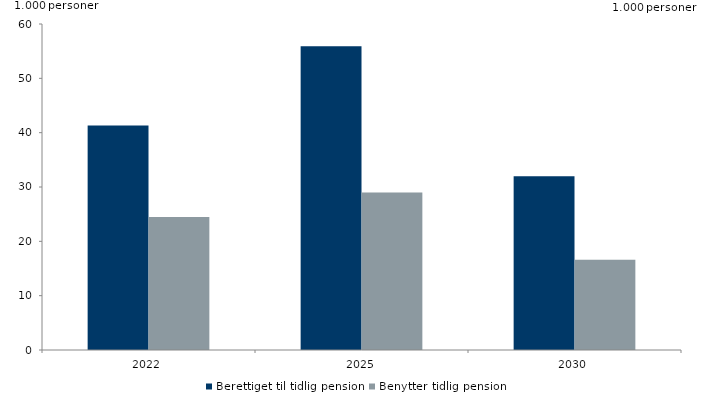
| Category | Berettiget til tidlig pension | Benytter tidlig pension |
|---|---|---|
| 2022.0 | 41.3 | 24.5 |
| 2025.0 | 55.9 | 29 |
| 2030.0 | 32 | 16.6 |